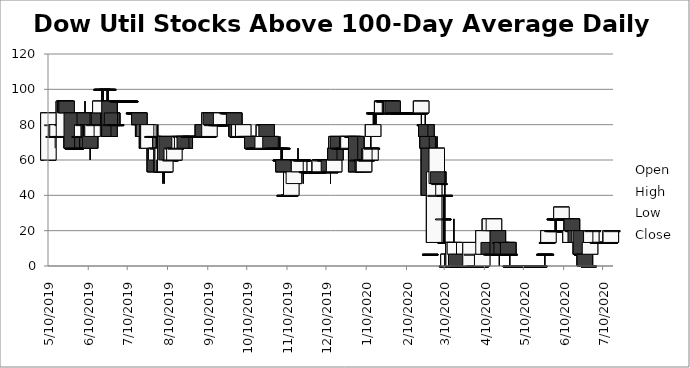
| Category | Open | High | Low | Close |
|---|---|---|---|---|
| 5/10/19 | 60 | 86.66 | 60 | 86.66 |
| 5/13/19 | 80 | 80 | 73.33 | 80 |
| 5/14/19 | 73.33 | 80 | 73.33 | 73.33 |
| 5/15/19 | 73.33 | 73.33 | 66.66 | 73.33 |
| 5/16/19 | 73.33 | 80 | 73.33 | 80 |
| 5/17/19 | 73.33 | 80 | 73.33 | 80 |
| 5/20/19 | 73.33 | 86.66 | 73.33 | 73.33 |
| 5/21/19 | 80 | 93.33 | 80 | 80 |
| 5/22/19 | 73.33 | 93.33 | 73.33 | 93.33 |
| 5/23/19 | 93.33 | 93.33 | 80 | 86.66 |
| 5/24/19 | 93.33 | 93.33 | 86.66 | 86.66 |
| 5/28/19 | 86.66 | 86.66 | 66.66 | 66.66 |
| 5/29/19 | 66.66 | 66.66 | 66.66 | 66.66 |
| 5/30/19 | 66.66 | 73.33 | 66.66 | 66.66 |
| 5/31/19 | 66.66 | 66.66 | 66.66 | 66.66 |
| 6/3/19 | 73.33 | 73.33 | 66.66 | 73.33 |
| 6/4/19 | 73.33 | 73.33 | 73.33 | 73.33 |
| 6/5/19 | 73.33 | 80 | 73.33 | 80 |
| 6/6/19 | 80 | 86.66 | 80 | 80 |
| 6/7/19 | 86.66 | 93.33 | 80 | 80 |
| 6/10/19 | 80 | 80 | 73.33 | 73.33 |
| 6/11/19 | 80 | 80 | 60 | 66.66 |
| 6/12/19 | 80 | 80 | 73.33 | 73.33 |
| 6/13/19 | 73.33 | 80 | 73.33 | 80 |
| 6/14/19 | 80 | 86.66 | 73.33 | 80 |
| 6/17/19 | 86.66 | 93.33 | 80 | 80 |
| 6/18/19 | 86.66 | 86.66 | 80 | 80 |
| 6/19/19 | 86.66 | 93.33 | 80 | 93.33 |
| 6/20/19 | 100 | 100 | 93.33 | 100 |
| 6/21/19 | 100 | 100 | 93.33 | 100 |
| 6/24/19 | 100 | 100 | 93.33 | 100 |
| 6/25/19 | 100 | 100 | 93.33 | 100 |
| 6/26/19 | 93.33 | 93.33 | 73.33 | 73.33 |
| 6/27/19 | 80 | 80 | 73.33 | 80 |
| 6/28/19 | 86.66 | 86.66 | 80 | 80 |
| 7/1/19 | 80 | 80 | 80 | 80 |
| 7/2/19 | 93.33 | 93.33 | 80 | 93.33 |
| 7/3/19 | 93.33 | 93.33 | 93.33 | 93.33 |
| 7/5/19 | 93.33 | 93.33 | 93.33 | 93.33 |
| 7/8/19 | 93.33 | 93.33 | 93.33 | 93.33 |
| 7/9/19 | 93.33 | 93.33 | 93.33 | 93.33 |
| 7/10/19 | 93.33 | 93.33 | 93.33 | 93.33 |
| 7/11/19 | 93.33 | 93.33 | 93.33 | 93.33 |
| 7/12/19 | 93.33 | 93.33 | 93.33 | 93.33 |
| 7/15/19 | 86.66 | 86.66 | 86.66 | 86.66 |
| 7/16/19 | 86.66 | 86.66 | 80 | 86.66 |
| 7/17/19 | 86.66 | 86.66 | 86.66 | 86.66 |
| 7/18/19 | 86.66 | 86.66 | 86.66 | 86.66 |
| 7/19/19 | 86.66 | 86.66 | 80 | 80 |
| 7/22/19 | 80 | 80 | 73.33 | 73.33 |
| 7/23/19 | 73.33 | 80 | 73.33 | 80 |
| 7/24/19 | 73.33 | 80 | 73.33 | 80 |
| 7/25/19 | 80 | 80 | 66.66 | 66.66 |
| 7/26/19 | 66.66 | 80 | 66.66 | 80 |
| 7/29/19 | 73.33 | 73.33 | 66.66 | 73.33 |
| 7/30/19 | 73.33 | 80 | 60 | 73.33 |
| 7/31/19 | 66.66 | 73.33 | 53.33 | 53.33 |
| 8/1/19 | 60 | 73.33 | 60 | 66.66 |
| 8/2/19 | 66.66 | 80 | 60 | 66.66 |
| 8/5/19 | 66.66 | 73.33 | 53.33 | 53.33 |
| 8/6/19 | 53.33 | 66.66 | 46.66 | 66.66 |
| 8/7/19 | 60 | 60 | 46.66 | 53.33 |
| 8/8/19 | 53.33 | 73.33 | 53.33 | 73.33 |
| 8/9/19 | 73.33 | 73.33 | 60 | 60 |
| 8/12/19 | 60 | 60 | 60 | 60 |
| 8/13/19 | 60 | 66.66 | 60 | 66.66 |
| 8/14/19 | 66.66 | 66.66 | 66.66 | 66.66 |
| 8/15/19 | 60 | 66.66 | 60 | 66.66 |
| 8/16/19 | 66.66 | 66.66 | 66.66 | 66.66 |
| 8/19/19 | 66.66 | 73.33 | 66.66 | 73.33 |
| 8/20/19 | 73.33 | 73.33 | 66.66 | 73.33 |
| 8/21/19 | 66.66 | 73.33 | 66.66 | 73.33 |
| 8/22/19 | 73.33 | 73.33 | 73.33 | 73.33 |
| 8/23/19 | 73.33 | 73.33 | 66.66 | 66.66 |
| 8/26/19 | 73.33 | 73.33 | 66.66 | 73.33 |
| 8/27/19 | 73.33 | 73.33 | 73.33 | 73.33 |
| 8/28/19 | 73.33 | 73.33 | 73.33 | 73.33 |
| 8/29/19 | 73.33 | 73.33 | 73.33 | 73.33 |
| 8/30/19 | 73.33 | 73.33 | 73.33 | 73.33 |
| 9/3/19 | 73.33 | 73.33 | 73.33 | 73.33 |
| 9/4/19 | 73.33 | 73.33 | 73.33 | 73.33 |
| 9/5/19 | 73.33 | 73.33 | 73.33 | 73.33 |
| 9/6/19 | 80 | 80 | 73.33 | 73.33 |
| 9/9/19 | 73.33 | 73.33 | 73.33 | 73.33 |
| 9/10/19 | 73.33 | 73.33 | 73.33 | 73.33 |
| 9/11/19 | 73.33 | 86.66 | 73.33 | 86.66 |
| 9/12/19 | 86.66 | 86.66 | 80 | 80 |
| 9/13/19 | 80 | 80 | 80 | 80 |
| 9/16/19 | 80 | 80 | 80 | 80 |
| 9/17/19 | 80 | 80 | 80 | 80 |
| 9/18/19 | 80 | 80 | 80 | 80 |
| 9/19/19 | 80 | 80 | 80 | 80 |
| 9/20/19 | 80 | 86.66 | 80 | 86.66 |
| 9/23/19 | 80 | 80 | 80 | 80 |
| 9/24/19 | 80 | 86.66 | 80 | 80 |
| 9/25/19 | 86.66 | 86.66 | 86.66 | 86.66 |
| 9/26/19 | 86.66 | 86.66 | 86.66 | 86.66 |
| 9/27/19 | 86.66 | 86.66 | 80 | 86.66 |
| 9/30/19 | 86.66 | 86.66 | 80 | 80 |
| 10/1/19 | 80 | 80 | 80 | 80 |
| 10/2/19 | 80 | 80 | 73.33 | 73.33 |
| 10/3/19 | 73.33 | 73.33 | 73.33 | 73.33 |
| 10/4/19 | 73.33 | 80 | 73.33 | 80 |
| 10/7/19 | 73.33 | 80 | 73.33 | 80 |
| 10/8/19 | 73.33 | 73.33 | 73.33 | 73.33 |
| 10/9/19 | 73.33 | 73.33 | 73.33 | 73.33 |
| 10/10/19 | 73.33 | 73.33 | 73.33 | 73.33 |
| 10/11/19 | 73.33 | 73.33 | 73.33 | 73.33 |
| 10/14/19 | 73.33 | 73.33 | 66.66 | 66.66 |
| 10/15/19 | 66.66 | 66.66 | 66.66 | 66.66 |
| 10/16/19 | 66.66 | 66.66 | 66.66 | 66.66 |
| 10/17/19 | 66.66 | 66.66 | 66.66 | 66.66 |
| 10/18/19 | 66.66 | 66.66 | 66.66 | 66.66 |
| 10/21/19 | 66.66 | 66.66 | 66.66 | 66.66 |
| 10/22/19 | 66.66 | 80 | 66.66 | 73.33 |
| 10/23/19 | 73.33 | 80 | 73.33 | 80 |
| 10/24/19 | 80 | 80 | 80 | 80 |
| 10/25/19 | 80 | 80 | 73.33 | 73.33 |
| 10/28/19 | 73.33 | 73.33 | 66.66 | 66.66 |
| 10/29/19 | 66.66 | 66.66 | 66.66 | 66.66 |
| 10/30/19 | 66.66 | 66.66 | 66.66 | 66.66 |
| 10/31/19 | 66.66 | 66.66 | 66.66 | 66.66 |
| 11/1/19 | 66.66 | 66.66 | 66.66 | 66.66 |
| 11/4/19 | 66.66 | 73.33 | 66.66 | 66.66 |
| 11/5/19 | 60 | 66.66 | 60 | 60 |
| 11/6/19 | 66.66 | 66.66 | 60 | 66.66 |
| 11/7/19 | 60 | 60 | 53.33 | 53.33 |
| 11/8/19 | 40 | 46.66 | 40 | 40 |
| 11/11/19 | 40 | 40 | 40 | 40 |
| 11/12/19 | 40 | 40 | 40 | 40 |
| 11/13/19 | 40 | 53.33 | 40 | 53.33 |
| 11/14/19 | 53.33 | 60 | 53.33 | 53.33 |
| 11/15/19 | 46.66 | 53.33 | 46.66 | 53.33 |
| 11/18/19 | 60 | 66.66 | 60 | 60 |
| 11/19/19 | 53.33 | 60 | 53.33 | 60 |
| 11/20/19 | 60 | 60 | 60 | 60 |
| 11/21/19 | 60 | 60 | 60 | 60 |
| 11/22/19 | 60 | 60 | 46.66 | 60 |
| 11/25/19 | 53.33 | 53.33 | 53.33 | 53.33 |
| 11/26/19 | 53.33 | 53.33 | 53.33 | 53.33 |
| 11/27/19 | 53.33 | 53.33 | 53.33 | 53.33 |
| 11/29/19 | 53.33 | 53.33 | 53.33 | 53.33 |
| 12/2/19 | 53.33 | 53.33 | 53.33 | 53.33 |
| 12/3/19 | 53.33 | 53.33 | 53.33 | 53.33 |
| 12/4/19 | 53.33 | 53.33 | 53.33 | 53.33 |
| 12/5/19 | 53.33 | 60 | 53.33 | 60 |
| 12/6/19 | 60 | 60 | 60 | 60 |
| 12/9/19 | 60 | 60 | 60 | 60 |
| 12/10/19 | 60 | 60 | 60 | 60 |
| 12/11/19 | 60 | 60 | 60 | 60 |
| 12/12/19 | 60 | 60 | 53.33 | 53.33 |
| 12/13/19 | 53.33 | 60 | 46.66 | 53.33 |
| 12/16/19 | 53.33 | 60 | 53.33 | 60 |
| 12/17/19 | 66.66 | 73.33 | 60 | 60 |
| 12/18/19 | 66.66 | 73.33 | 60 | 73.33 |
| 12/19/19 | 73.33 | 73.33 | 66.66 | 66.66 |
| 12/20/19 | 66.66 | 73.33 | 66.66 | 66.66 |
| 12/23/19 | 66.66 | 66.66 | 66.66 | 66.66 |
| 12/24/19 | 66.66 | 66.66 | 66.66 | 66.66 |
| 12/26/19 | 66.66 | 66.66 | 66.66 | 66.66 |
| 12/27/19 | 66.66 | 73.33 | 66.66 | 73.33 |
| 12/30/19 | 73.33 | 73.33 | 66.66 | 73.33 |
| 12/31/19 | 73.33 | 73.33 | 66.66 | 73.33 |
| 1/2/20 | 73.33 | 73.33 | 53.33 | 53.33 |
| 1/3/20 | 60 | 73.33 | 60 | 60 |
| 1/6/20 | 60 | 66.66 | 60 | 60 |
| 1/7/20 | 60 | 60 | 53.33 | 53.33 |
| 1/8/20 | 53.33 | 60 | 53.33 | 60 |
| 1/9/20 | 60 | 60 | 60 | 60 |
| 1/10/20 | 60 | 66.66 | 60 | 60 |
| 1/13/20 | 60 | 73.33 | 60 | 66.66 |
| 1/14/20 | 66.66 | 66.66 | 60 | 66.66 |
| 1/15/20 | 73.33 | 86.66 | 73.33 | 80 |
| 1/16/20 | 86.66 | 86.66 | 80 | 86.66 |
| 1/17/20 | 86.66 | 86.66 | 80 | 86.66 |
| 1/21/20 | 86.66 | 86.66 | 86.66 | 86.66 |
| 1/22/20 | 86.66 | 93.33 | 86.66 | 93.33 |
| 1/23/20 | 93.33 | 93.33 | 93.33 | 93.33 |
| 1/24/20 | 93.33 | 93.33 | 93.33 | 93.33 |
| 1/27/20 | 93.33 | 93.33 | 93.33 | 93.33 |
| 1/28/20 | 93.33 | 93.33 | 86.66 | 86.66 |
| 1/29/20 | 86.66 | 93.33 | 86.66 | 93.33 |
| 1/30/20 | 93.33 | 93.33 | 86.66 | 86.66 |
| 1/31/20 | 86.66 | 86.66 | 86.66 | 86.66 |
| 2/3/20 | 86.66 | 86.66 | 86.66 | 86.66 |
| 2/4/20 | 86.66 | 86.66 | 86.66 | 86.66 |
| 2/5/20 | 86.66 | 86.66 | 86.66 | 86.66 |
| 2/6/20 | 86.66 | 86.66 | 86.66 | 86.66 |
| 2/7/20 | 86.66 | 86.66 | 86.66 | 86.66 |
| 2/10/20 | 86.66 | 86.66 | 86.66 | 86.66 |
| 2/11/20 | 86.66 | 86.66 | 86.66 | 86.66 |
| 2/12/20 | 86.66 | 86.66 | 86.66 | 86.66 |
| 2/13/20 | 86.66 | 86.66 | 86.66 | 86.66 |
| 2/14/20 | 86.66 | 86.66 | 86.66 | 86.66 |
| 2/18/20 | 86.66 | 86.66 | 86.66 | 86.66 |
| 2/19/20 | 86.66 | 86.66 | 86.66 | 86.66 |
| 2/20/20 | 86.66 | 86.66 | 86.66 | 86.66 |
| 2/21/20 | 86.66 | 93.33 | 80 | 93.33 |
| 2/24/20 | 80 | 86.66 | 80 | 80 |
| 2/25/20 | 80 | 80 | 73.33 | 73.33 |
| 2/26/20 | 73.33 | 80 | 66.66 | 66.66 |
| 2/27/20 | 66.66 | 73.33 | 40 | 40 |
| 2/28/20 | 6.66 | 6.66 | 6.66 | 6.66 |
| 3/2/20 | 13.33 | 53.33 | 13.33 | 53.33 |
| 3/3/20 | 40 | 66.66 | 40 | 40 |
| 3/4/20 | 46.66 | 73.33 | 46.66 | 66.66 |
| 3/5/20 | 53.33 | 53.33 | 46.66 | 46.66 |
| 3/6/20 | 46.66 | 46.66 | 46.66 | 46.66 |
| 3/9/20 | 26.66 | 40 | 13.33 | 26.66 |
| 3/10/20 | 40 | 53.33 | 13.33 | 40 |
| 3/11/20 | 13.33 | 13.33 | 6.66 | 13.33 |
| 3/12/20 | 0.01 | 6.66 | 0.01 | 0.01 |
| 3/13/20 | 0.01 | 6.66 | 0.01 | 6.66 |
| 3/16/20 | 6.66 | 6.66 | 0.01 | 0.01 |
| 3/17/20 | 0.01 | 26.66 | 0.01 | 13.33 |
| 3/18/20 | 6.66 | 13.33 | 0.01 | 13.33 |
| 3/19/20 | 6.66 | 13.33 | 0.01 | 0.01 |
| 3/20/20 | 0.01 | 0.01 | 0.01 | 0.01 |
| 3/23/20 | 0.01 | 0.01 | 0.01 | 0.01 |
| 3/24/20 | 0.01 | 0.01 | 0.01 | 0.01 |
| 3/25/20 | 0.01 | 0.01 | 0.01 | 0.01 |
| 3/26/20 | 0.01 | 0.01 | 0.01 | 0.01 |
| 3/27/20 | 0.01 | 0.01 | 0.01 | 0.01 |
| 3/30/20 | 0.01 | 13.33 | 0.01 | 13.33 |
| 3/31/20 | 6.66 | 6.66 | 6.66 | 6.66 |
| 4/1/20 | 0.01 | 0.01 | 0.01 | 0.01 |
| 4/2/20 | 0.01 | 0.01 | 0.01 | 0.01 |
| 4/3/20 | 0.01 | 0.01 | 0.01 | 0.01 |
| 4/6/20 | 0.01 | 0.01 | 0.01 | 0.01 |
| 4/7/20 | 0.01 | 0.01 | 0.01 | 0.01 |
| 4/8/20 | 0.01 | 6.66 | 0.01 | 6.66 |
| 4/9/20 | 6.66 | 26.66 | 6.66 | 20 |
| 4/13/20 | 13.33 | 13.33 | 6.66 | 6.66 |
| 4/14/20 | 20 | 26.66 | 6.66 | 26.66 |
| 4/15/20 | 6.66 | 6.66 | 6.66 | 6.66 |
| 4/16/20 | 6.66 | 13.33 | 6.66 | 6.66 |
| 4/17/20 | 20 | 26.66 | 6.66 | 26.66 |
| 4/20/20 | 20 | 20 | 6.66 | 6.66 |
| 4/21/20 | 6.66 | 6.66 | 0.01 | 6.66 |
| 4/22/20 | 13.33 | 13.33 | 13.33 | 13.33 |
| 4/23/20 | 13.33 | 13.33 | 6.66 | 6.66 |
| 4/24/20 | 6.66 | 6.66 | 6.66 | 6.66 |
| 4/27/20 | 13.33 | 13.33 | 13.33 | 13.33 |
| 4/28/20 | 13.33 | 13.33 | 6.66 | 6.66 |
| 4/29/20 | 6.66 | 6.66 | 0.01 | 6.66 |
| 4/30/20 | 0.01 | 0.01 | 0.01 | 0.01 |
| 5/1/20 | 0.01 | 0.01 | 0.01 | 0.01 |
| 5/4/20 | 0.01 | 0.01 | 0.01 | 0.01 |
| 5/5/20 | 0.01 | 0.01 | 0.01 | 0.01 |
| 5/6/20 | 0.01 | 0.01 | 0.01 | 0.01 |
| 5/7/20 | 0.01 | 0.01 | 0.01 | 0.01 |
| 5/8/20 | 0.01 | 0.01 | 0.01 | 0.01 |
| 5/11/20 | 0.01 | 0.01 | 0.01 | 0.01 |
| 5/12/20 | 0.01 | 0.01 | 0.01 | 0.01 |
| 5/13/20 | 0.01 | 0.01 | 0.01 | 0.01 |
| 5/14/20 | 0.01 | 0.01 | 0.01 | 0.01 |
| 5/15/20 | 0.01 | 0.01 | 0.01 | 0.01 |
| 5/18/20 | 0.01 | 0.01 | 0.01 | 0.01 |
| 5/19/20 | 0.01 | 0.01 | 0.01 | 0.01 |
| 5/20/20 | 0.01 | 0.01 | 0.01 | 0.01 |
| 5/21/20 | 0.01 | 0.01 | 0.01 | 0.01 |
| 5/22/20 | 0.01 | 0.01 | 0.01 | 0.01 |
| 5/26/20 | 6.66 | 6.66 | 0.01 | 6.66 |
| 5/27/20 | 6.66 | 6.66 | 6.66 | 6.66 |
| 5/28/20 | 13.33 | 13.33 | 13.33 | 13.33 |
| 5/29/20 | 13.33 | 20 | 13.33 | 20 |
| 6/1/20 | 20 | 20 | 20 | 20 |
| 6/2/20 | 20 | 20 | 20 | 20 |
| 6/3/20 | 26.66 | 26.66 | 20 | 26.66 |
| 6/4/20 | 20 | 26.66 | 20 | 20 |
| 6/5/20 | 26.66 | 33.33 | 26.66 | 26.66 |
| 6/8/20 | 26.66 | 33.33 | 26.66 | 33.33 |
| 6/9/20 | 26.66 | 26.66 | 26.66 | 26.66 |
| 6/10/20 | 26.66 | 26.66 | 26.66 | 26.66 |
| 6/11/20 | 20 | 20 | 20 | 20 |
| 6/12/20 | 20 | 20 | 20 | 20 |
| 6/15/20 | 13.33 | 20 | 13.33 | 20 |
| 6/16/20 | 26.66 | 26.66 | 20 | 20 |
| 6/17/20 | 20 | 20 | 20 | 20 |
| 6/18/20 | 20 | 20 | 20 | 20 |
| 6/19/20 | 20 | 20 | 13.33 | 13.33 |
| 6/22/20 | 13.33 | 20 | 13.33 | 20 |
| 6/23/20 | 20 | 20 | 6.66 | 6.66 |
| 6/24/20 | 6.66 | 6.66 | 6.66 | 6.66 |
| 6/25/20 | 6.66 | 6.66 | 0.01 | 6.66 |
| 6/26/20 | 6.66 | 6.66 | 0.01 | 0.01 |
| 6/29/20 | 0.01 | 0.01 | 0.01 | 0.01 |
| 6/30/20 | 6.66 | 13.33 | 6.66 | 13.33 |
| 7/1/20 | 13.33 | 20 | 13.33 | 20 |
| 7/2/20 | 20 | 20 | 13.33 | 20 |
| 7/6/20 | 13.33 | 13.33 | 13.33 | 13.33 |
| 7/7/20 | 13.33 | 13.33 | 13.33 | 13.33 |
| 7/8/20 | 13.33 | 13.33 | 13.33 | 13.33 |
| 7/9/20 | 13.33 | 13.33 | 13.33 | 13.33 |
| 7/10/20 | 13.33 | 13.33 | 13.33 | 13.33 |
| 7/13/20 | 13.33 | 13.33 | 13.33 | 13.33 |
| 7/14/20 | 13.33 | 13.33 | 13.33 | 13.33 |
| 7/15/20 | 13.33 | 20 | 13.33 | 13.33 |
| 7/16/20 | 13.33 | 20 | 13.33 | 20 |
| 7/17/20 | 20 | 20 | 20 | 20 |